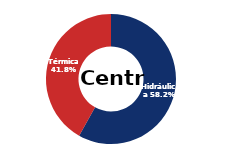
| Category | Centro |
|---|---|
| Eólica | 0 |
| Hidráulica | 2223.813 |
| Solar | 0.006 |
| Térmica | 1600.124 |